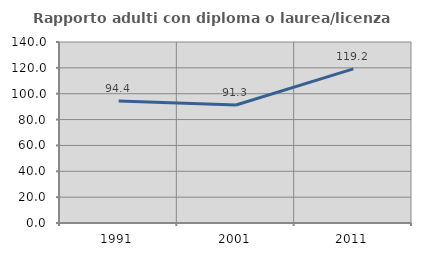
| Category | Rapporto adulti con diploma o laurea/licenza media  |
|---|---|
| 1991.0 | 94.444 |
| 2001.0 | 91.304 |
| 2011.0 | 119.231 |